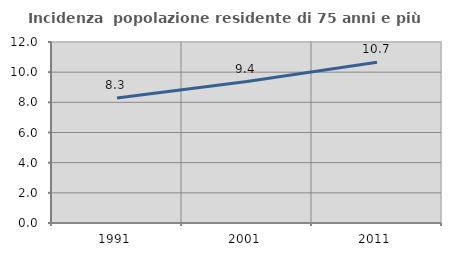
| Category | Incidenza  popolazione residente di 75 anni e più |
|---|---|
| 1991.0 | 8.283 |
| 2001.0 | 9.377 |
| 2011.0 | 10.658 |